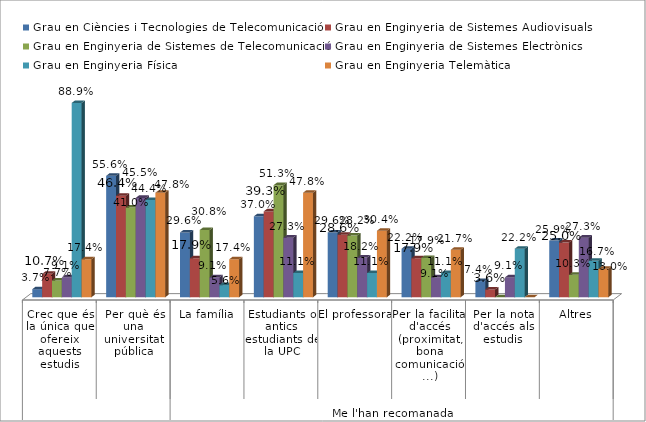
| Category | Grau en Ciències i Tecnologies de Telecomunicació | Grau en Enginyeria de Sistemes Audiovisuals | Grau en Enginyeria de Sistemes de Telecomunicació | Grau en Enginyeria de Sistemes Electrònics | Grau en Enginyeria Física | Grau en Enginyeria Telemàtica |
|---|---|---|---|---|---|---|
| 0 | 0.037 | 0.107 | 0.077 | 0.091 | 0.889 | 0.174 |
| 1 | 0.556 | 0.464 | 0.41 | 0.455 | 0.444 | 0.478 |
| 2 | 0.296 | 0.179 | 0.308 | 0.091 | 0.056 | 0.174 |
| 3 | 0.37 | 0.393 | 0.513 | 0.273 | 0.111 | 0.478 |
| 4 | 0.296 | 0.286 | 0.282 | 0.182 | 0.111 | 0.304 |
| 5 | 0.222 | 0.179 | 0.179 | 0.091 | 0.111 | 0.217 |
| 6 | 0.074 | 0.036 | 0 | 0.091 | 0.222 | 0 |
| 7 | 0.259 | 0.25 | 0.103 | 0.273 | 0.167 | 0.13 |